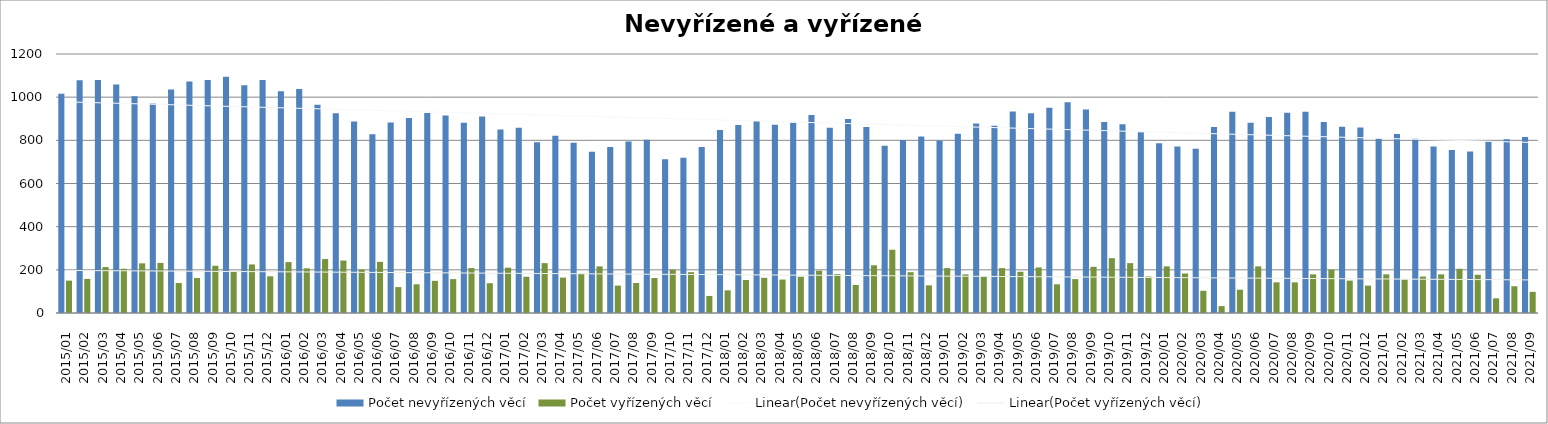
| Category | Počet nevyřízených věcí | Počet vyřízených věcí |
|---|---|---|
| 2015/01 | 1016 | 150 |
| 2015/02 | 1078 | 158 |
| 2015/03 | 1080 | 213 |
| 2015/04 | 1059 | 205 |
| 2015/05 | 1004 | 230 |
| 2015/06 | 971 | 232 |
| 2015/07 | 1035 | 139 |
| 2015/08 | 1073 | 162 |
| 2015/09 | 1079 | 219 |
| 2015/10 | 1095 | 191 |
| 2015/11 | 1055 | 225 |
| 2015/12 | 1080 | 170 |
| 2016/01 | 1027 | 236 |
| 2016/02 | 1038 | 207 |
| 2016/03 | 965 | 250 |
| 2016/04 | 925 | 243 |
| 2016/05 | 887 | 201 |
| 2016/06 | 828 | 237 |
| 2016/07 | 883 | 120 |
| 2016/08 | 904 | 133 |
| 2016/09 | 927 | 149 |
| 2016/10 | 915 | 157 |
| 2016/11 | 881 | 208 |
| 2016/12 | 910 | 138 |
| 2017/01 | 850 | 210 |
| 2017/02 | 858 | 168 |
| 2017/03 | 791 | 231 |
| 2017/04 | 821 | 164 |
| 2017/05 | 789 | 182 |
| 2017/06 | 747 | 216 |
| 2017/07 | 769 | 127 |
| 2017/08 | 795 | 139 |
| 2017/09 | 803 | 162 |
| 2017/10 | 712 | 201 |
| 2017/11 | 719 | 189 |
| 2017/12 | 769 | 79 |
| 2018/01 | 848 | 105 |
| 2018/02 | 871 | 153 |
| 2018/03 | 889 | 163 |
| 2018/04 | 872 | 155 |
| 2018/05 | 882 | 168 |
| 2018/06 | 917 | 196 |
| 2018/07 | 858 | 180 |
| 2018/08 | 899 | 130 |
| 2018/09 | 862 | 221 |
| 2018/10 | 775 | 293 |
| 2018/11 | 801 | 189 |
| 2018/12 | 818 | 128 |
| 2019/01 | 799 | 208 |
| 2019/02 | 830 | 179 |
| 2019/03 | 878 | 170 |
| 2019/04 | 867 | 208 |
| 2019/05 | 934 | 191 |
| 2019/06 | 926 | 211 |
| 2019/07 | 951 | 133 |
| 2019/08 | 976 | 157 |
| 2019/09 | 943 | 214 |
| 2019/10 | 885 | 254 |
| 2019/11 | 875 | 231 |
| 2019/12 | 837 | 169 |
| 2020/01 | 786 | 216 |
| 2020/02 | 772 | 183 |
| 2020/03 | 761 | 103 |
| 2020/04 | 862 | 32 |
| 2020/05 | 932 | 108 |
| 2020/06 | 882 | 216 |
| 2020/07 | 908 | 142 |
| 2020/08 | 928 | 142 |
| 2020/09 | 933 | 179 |
| 2020/10 | 885 | 201 |
| 2020/11 | 863 | 150 |
| 2020/12 | 860 | 127 |
| 2021/01 | 808 | 179 |
| 2021/02 | 829 | 155 |
| 2021/03 | 807 | 169 |
| 2021/04 | 771 | 179 |
| 2021/05 | 755 | 205 |
| 2021/06 | 748 | 177 |
| 2021/07 | 795 | 68 |
| 2021/08 | 805 | 124 |
| 2021/09 | 815 | 98 |